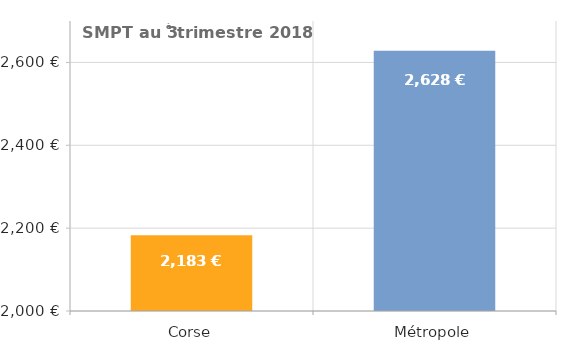
| Category | Brut |
|---|---|
| Corse | 2183 |
| Métropole | 2628 |